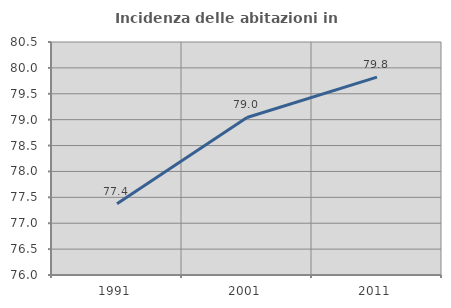
| Category | Incidenza delle abitazioni in proprietà  |
|---|---|
| 1991.0 | 77.377 |
| 2001.0 | 79.042 |
| 2011.0 | 79.822 |